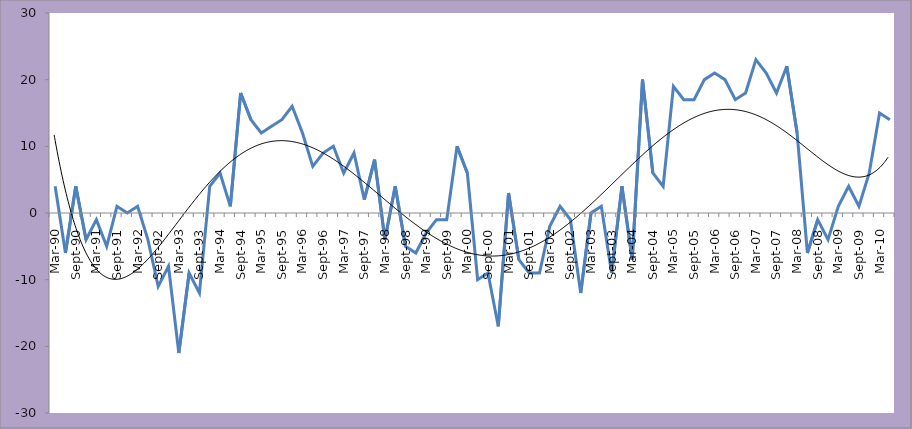
| Category | FNB/BER Consumer Confidence Index |
|---|---|
| Mar-90 | 4 |
| Jun-90 | -6 |
| Sep-90 | 4 |
| Dec-90 | -4 |
| Mar-91 | -1 |
| Jun-91 | -5 |
| Sep-91 | 1 |
| Dec-91 | 0 |
| Mar-92 | 1 |
| Jun-92 | -4 |
| Sep-92 | -11 |
| Dec-92 | -8 |
| Mar-93 | -21 |
| Jun-93 | -9 |
| Sep-93 | -12 |
| Dec-93 | 4 |
| Mar-94 | 6 |
| Jun-94 | 1 |
| Sep-94 | 18 |
| Dec-94 | 14 |
| Mar-95 | 12 |
| Jun-95 | 13 |
| Sep-95 | 14 |
| Dec-95 | 16 |
| Mar-96 | 12 |
| Jun-96 | 7 |
| Sep-96 | 9 |
| Dec-96 | 10 |
| Mar-97 | 6 |
| Jun-97 | 9 |
| Sep-97 | 2 |
| Dec-97 | 8 |
| Mar-98 | -4 |
| Jun-98 | 4 |
| Sep-98 | -5 |
| Dec-98 | -6 |
| Mar-99 | -3 |
| Jun-99 | -1 |
| Sep-99 | -1 |
| Dec-99 | 10 |
| Mar-00 | 6 |
| Jun-00 | -10 |
| Sep-00 | -9 |
| Dec-00 | -17 |
| Mar-01 | 3 |
| Jun-01 | -7 |
| Sep-01 | -9 |
| Dec-01 | -9 |
| Mar-02 | -2 |
| Jun-02 | 1 |
| Sep-02 | -1 |
| Dec-02 | -12 |
| Mar-03 | 0 |
| Jun-03 | 1 |
| Sep-03 | -9 |
| Dec-03 | 4 |
| Mar-04 | -7 |
| Jun-04 | 20 |
| Sep-04 | 6 |
| Dec-04 | 4 |
| Mar-05 | 19 |
| Jun-05 | 17 |
| Sep-05 | 17 |
| Dec-05 | 20 |
| Mar-06 | 21 |
| Jun-06 | 20 |
| Sep-06 | 17 |
| Dec-06 | 18 |
| Mar-07 | 23 |
| Jun-07 | 21 |
| Sep-07 | 18 |
| Dec-07 | 22 |
| Mar-08 | 12 |
| Jun-08 | -6 |
| Sep-08 | -1 |
| Dec-08 | -4 |
| Mar-09 | 1 |
| Jun-09 | 4 |
| Sep-09 | 1 |
| Dec-09 | 6 |
| Mar-10 | 15 |
| Jun-10 | 14 |